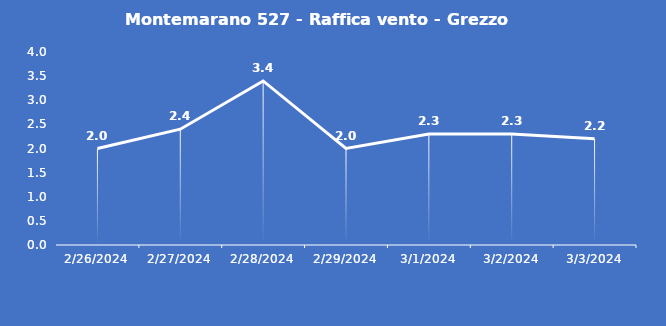
| Category | Montemarano 527 - Raffica vento - Grezzo (m/s) |
|---|---|
| 2/26/24 | 2 |
| 2/27/24 | 2.4 |
| 2/28/24 | 3.4 |
| 2/29/24 | 2 |
| 3/1/24 | 2.3 |
| 3/2/24 | 2.3 |
| 3/3/24 | 2.2 |